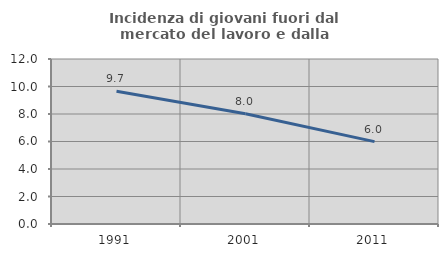
| Category | Incidenza di giovani fuori dal mercato del lavoro e dalla formazione  |
|---|---|
| 1991.0 | 9.657 |
| 2001.0 | 8.017 |
| 2011.0 | 5.99 |